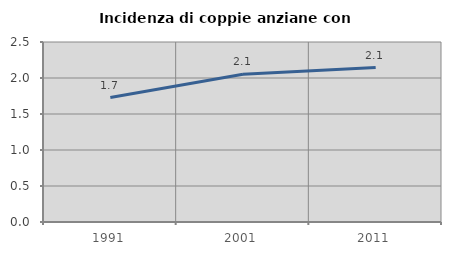
| Category | Incidenza di coppie anziane con figli |
|---|---|
| 1991.0 | 1.728 |
| 2001.0 | 2.052 |
| 2011.0 | 2.145 |